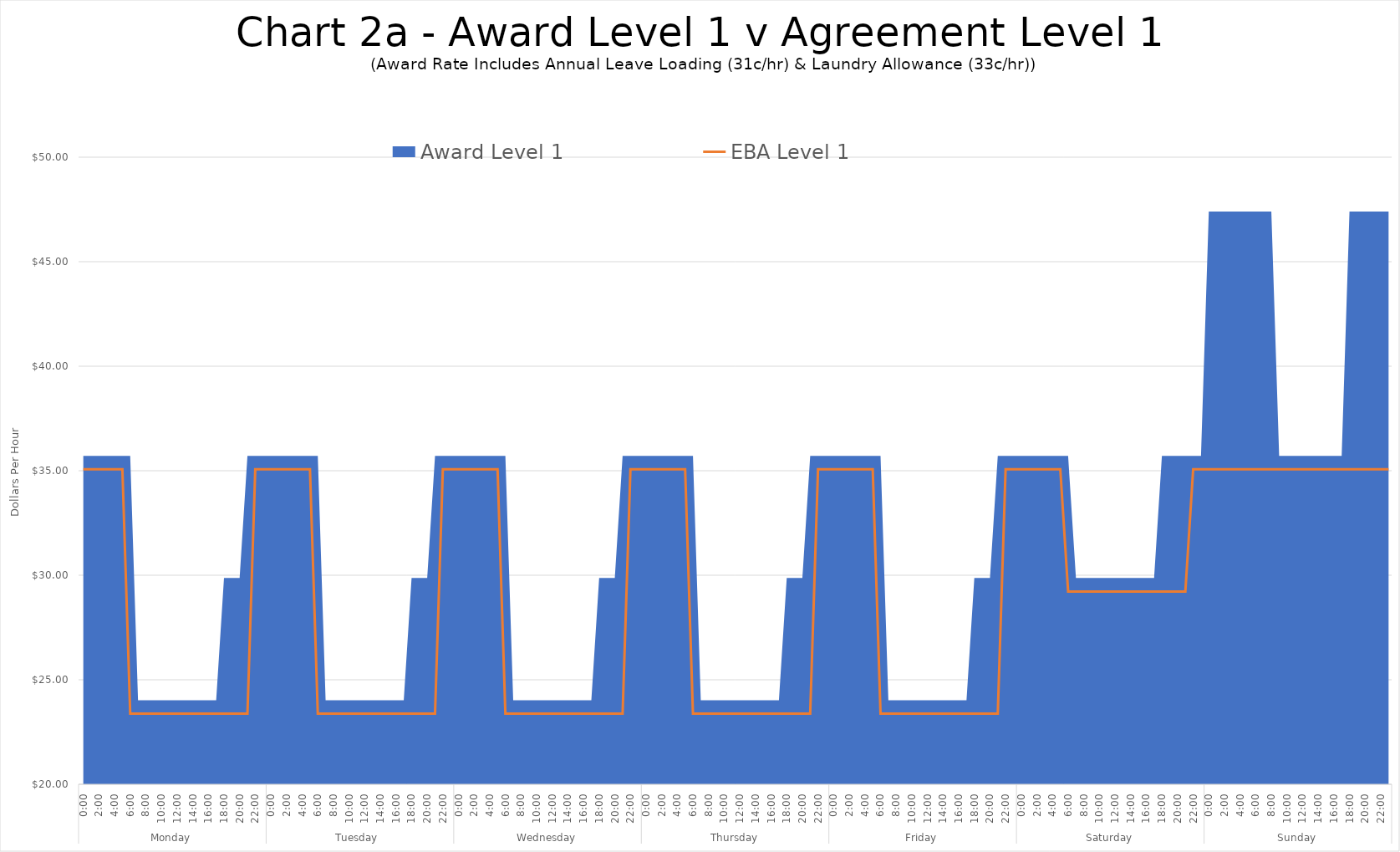
| Category | EBA Level 1 |
|---|---|
| 0 | 35.07 |
| 1 | 35.07 |
| 2 | 35.07 |
| 3 | 35.07 |
| 4 | 35.07 |
| 5 | 35.07 |
| 6 | 23.38 |
| 7 | 23.38 |
| 8 | 23.38 |
| 9 | 23.38 |
| 10 | 23.38 |
| 11 | 23.38 |
| 12 | 23.38 |
| 13 | 23.38 |
| 14 | 23.38 |
| 15 | 23.38 |
| 16 | 23.38 |
| 17 | 23.38 |
| 18 | 23.38 |
| 19 | 23.38 |
| 20 | 23.38 |
| 21 | 23.38 |
| 22 | 35.07 |
| 23 | 35.07 |
| 24 | 35.07 |
| 25 | 35.07 |
| 26 | 35.07 |
| 27 | 35.07 |
| 28 | 35.07 |
| 29 | 35.07 |
| 30 | 23.38 |
| 31 | 23.38 |
| 32 | 23.38 |
| 33 | 23.38 |
| 34 | 23.38 |
| 35 | 23.38 |
| 36 | 23.38 |
| 37 | 23.38 |
| 38 | 23.38 |
| 39 | 23.38 |
| 40 | 23.38 |
| 41 | 23.38 |
| 42 | 23.38 |
| 43 | 23.38 |
| 44 | 23.38 |
| 45 | 23.38 |
| 46 | 35.07 |
| 47 | 35.07 |
| 48 | 35.07 |
| 49 | 35.07 |
| 50 | 35.07 |
| 51 | 35.07 |
| 52 | 35.07 |
| 53 | 35.07 |
| 54 | 23.38 |
| 55 | 23.38 |
| 56 | 23.38 |
| 57 | 23.38 |
| 58 | 23.38 |
| 59 | 23.38 |
| 60 | 23.38 |
| 61 | 23.38 |
| 62 | 23.38 |
| 63 | 23.38 |
| 64 | 23.38 |
| 65 | 23.38 |
| 66 | 23.38 |
| 67 | 23.38 |
| 68 | 23.38 |
| 69 | 23.38 |
| 70 | 35.07 |
| 71 | 35.07 |
| 72 | 35.07 |
| 73 | 35.07 |
| 74 | 35.07 |
| 75 | 35.07 |
| 76 | 35.07 |
| 77 | 35.07 |
| 78 | 23.38 |
| 79 | 23.38 |
| 80 | 23.38 |
| 81 | 23.38 |
| 82 | 23.38 |
| 83 | 23.38 |
| 84 | 23.38 |
| 85 | 23.38 |
| 86 | 23.38 |
| 87 | 23.38 |
| 88 | 23.38 |
| 89 | 23.38 |
| 90 | 23.38 |
| 91 | 23.38 |
| 92 | 23.38 |
| 93 | 23.38 |
| 94 | 35.07 |
| 95 | 35.07 |
| 96 | 35.07 |
| 97 | 35.07 |
| 98 | 35.07 |
| 99 | 35.07 |
| 100 | 35.07 |
| 101 | 35.07 |
| 102 | 23.38 |
| 103 | 23.38 |
| 104 | 23.38 |
| 105 | 23.38 |
| 106 | 23.38 |
| 107 | 23.38 |
| 108 | 23.38 |
| 109 | 23.38 |
| 110 | 23.38 |
| 111 | 23.38 |
| 112 | 23.38 |
| 113 | 23.38 |
| 114 | 23.38 |
| 115 | 23.38 |
| 116 | 23.38 |
| 117 | 23.38 |
| 118 | 35.07 |
| 119 | 35.07 |
| 120 | 35.07 |
| 121 | 35.07 |
| 122 | 35.07 |
| 123 | 35.07 |
| 124 | 35.07 |
| 125 | 35.07 |
| 126 | 29.225 |
| 127 | 29.225 |
| 128 | 29.225 |
| 129 | 29.225 |
| 130 | 29.225 |
| 131 | 29.225 |
| 132 | 29.225 |
| 133 | 29.225 |
| 134 | 29.225 |
| 135 | 29.225 |
| 136 | 29.225 |
| 137 | 29.225 |
| 138 | 29.225 |
| 139 | 29.225 |
| 140 | 29.225 |
| 141 | 29.225 |
| 142 | 35.07 |
| 143 | 35.07 |
| 144 | 35.07 |
| 145 | 35.07 |
| 146 | 35.07 |
| 147 | 35.07 |
| 148 | 35.07 |
| 149 | 35.07 |
| 150 | 35.07 |
| 151 | 35.07 |
| 152 | 35.07 |
| 153 | 35.07 |
| 154 | 35.07 |
| 155 | 35.07 |
| 156 | 35.07 |
| 157 | 35.07 |
| 158 | 35.07 |
| 159 | 35.07 |
| 160 | 35.07 |
| 161 | 35.07 |
| 162 | 35.07 |
| 163 | 35.07 |
| 164 | 35.07 |
| 165 | 35.07 |
| 166 | 35.07 |
| 167 | 35.07 |